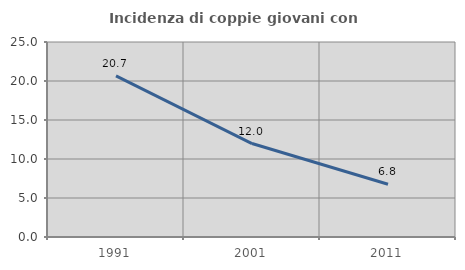
| Category | Incidenza di coppie giovani con figli |
|---|---|
| 1991.0 | 20.657 |
| 2001.0 | 11.982 |
| 2011.0 | 6.757 |